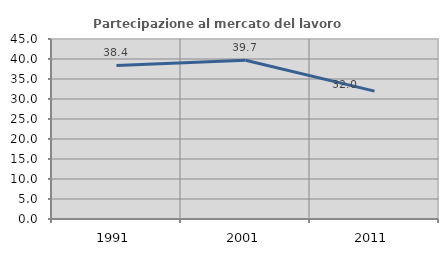
| Category | Partecipazione al mercato del lavoro  femminile |
|---|---|
| 1991.0 | 38.399 |
| 2001.0 | 39.7 |
| 2011.0 | 31.962 |